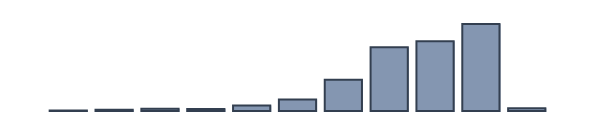
| Category | Series 0 |
|---|---|
| 0 | 0 |
| 1 | 0.174 |
| 2 | 0.435 |
| 3 | 0.783 |
| 4 | 0.739 |
| 5 | 2 |
| 6 | 4.174 |
| 7 | 11.217 |
| 8 | 22.957 |
| 9 | 25.174 |
| 10 | 31.391 |
| 11 | 0.957 |
| 12 | 0 |